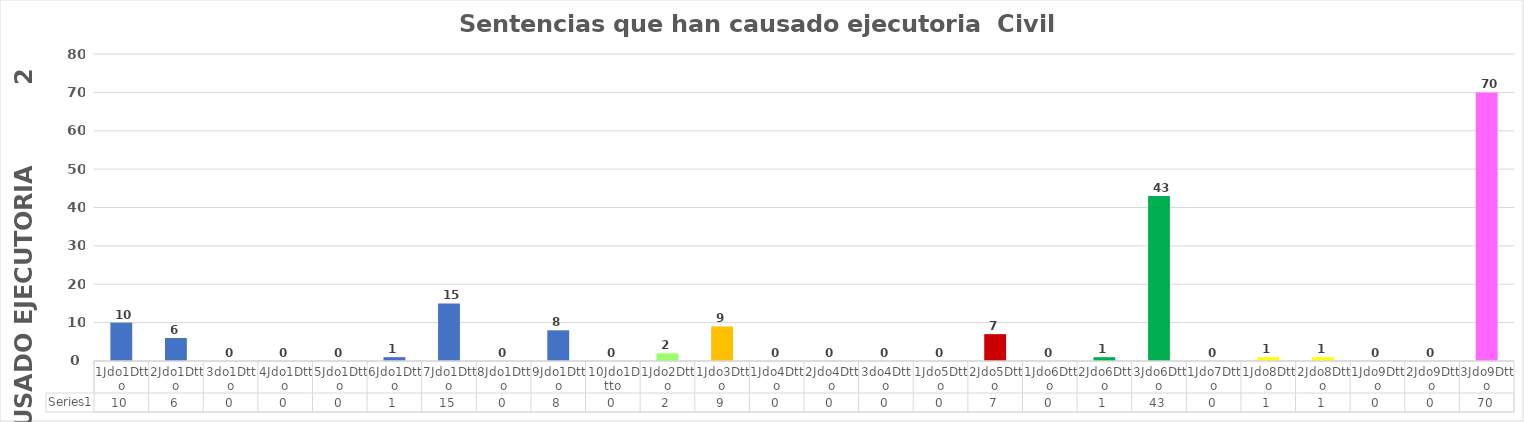
| Category | Series 0 |
|---|---|
| 1Jdo1Dtto | 10 |
| 2Jdo1Dtto | 6 |
| 3do1Dtto | 0 |
| 4Jdo1Dtto | 0 |
| 5Jdo1Dtto | 0 |
| 6Jdo1Dtto | 1 |
| 7Jdo1Dtto | 15 |
| 8Jdo1Dtto | 0 |
| 9Jdo1Dtto | 8 |
| 10Jdo1Dtto | 0 |
| 1Jdo2Dtto | 2 |
| 1Jdo3Dtto | 9 |
| 1Jdo4Dtto | 0 |
| 2Jdo4Dtto | 0 |
| 3do4Dtto | 0 |
| 1Jdo5Dtto | 0 |
| 2Jdo5Dtto | 7 |
| 1Jdo6Dtto | 0 |
| 2Jdo6Dtto | 1 |
| 3Jdo6Dtto | 43 |
| 1Jdo7Dtto | 0 |
| 1Jdo8Dtto | 1 |
| 2Jdo8Dtto | 1 |
| 1Jdo9Dtto | 0 |
| 2Jdo9Dtto | 0 |
| 3Jdo9Dtto | 70 |